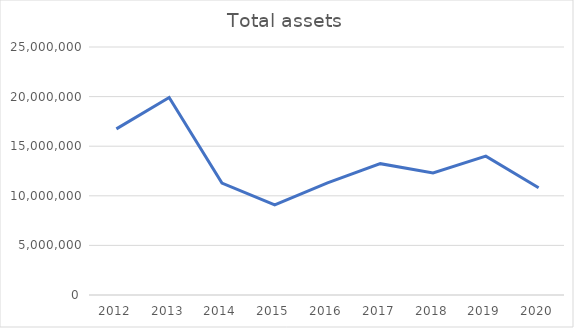
| Category | Total assets |
|---|---|
| 2012.0 | 16745903.789 |
| 2013.0 | 19908800.125 |
| 2014.0 | 11278507.133 |
| 2015.0 | 9073667.506 |
| 2016.0 | 11303485.152 |
| 2017.0 | 13240357.122 |
| 2018.0 | 12308044.681 |
| 2019.0 | 13997387.144 |
| 2020.0 | 10814361.776 |